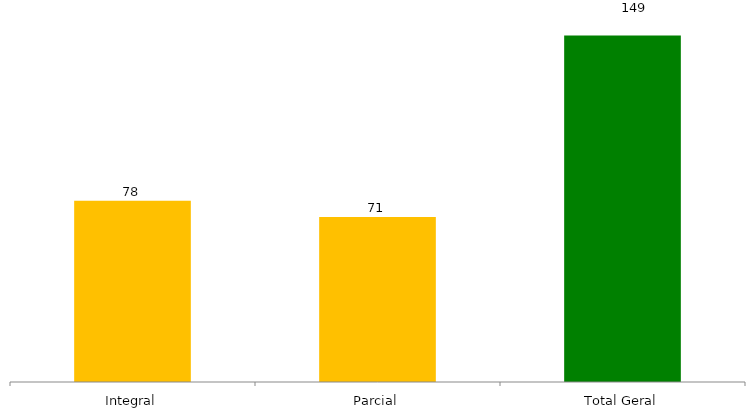
| Category | Categoria/Ano |
|---|---|
| Integral | 78 |
| Parcial | 71 |
| Total Geral | 149 |